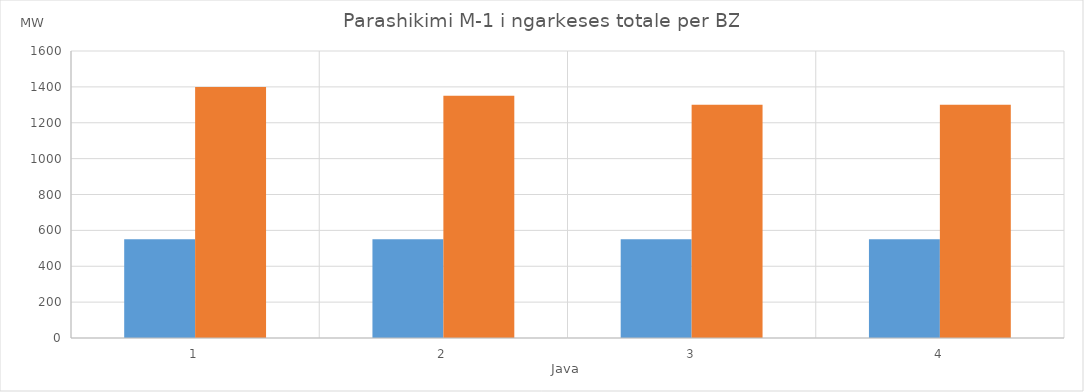
| Category | Min (MW) | Max (MW) |
|---|---|---|
| 0 | 550 | 1400 |
| 1 | 550 | 1350 |
| 2 | 550 | 1300 |
| 3 | 550 | 1300 |